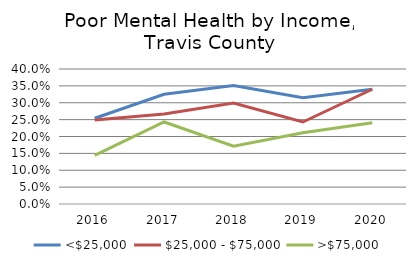
| Category | <$25,000 | $25,000 - $75,000 | >$75,000 |
|---|---|---|---|
| 2016.0 | 0.254 | 0.249 | 0.144 |
| 2017.0 | 0.325 | 0.267 | 0.243 |
| 2018.0 | 0.351 | 0.299 | 0.171 |
| 2019.0 | 0.315 | 0.243 | 0.211 |
| 2020.0 | 0.34 | 0.34 | 0.241 |